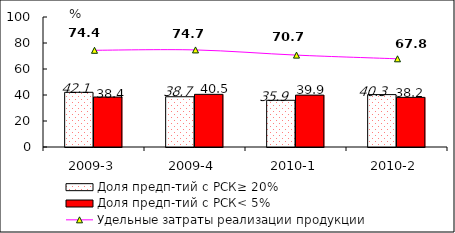
| Category | Доля предп-тий с РСК≥ 20% | Доля предп-тий с РСК< 5% |
|---|---|---|
| 2009-3 | 42.075 | 38.426 |
| 2009-4 | 38.657 | 40.509 |
| 2010-1 | 35.938 | 39.911 |
| 2010-2 | 40.307 | 38.184 |